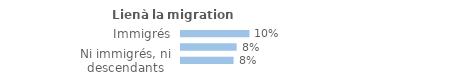
| Category | Series 0 |
|---|---|
| Immigrés | 0.102 |
| Descendants d'immigré(s) | 0.083 |
| Ni immigrés, ni descendants | 0.078 |